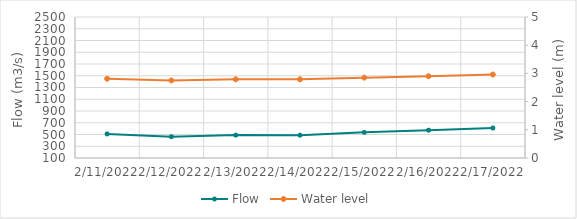
| Category | Flow |
|---|---|
| 7/29/21 | 614.92 |
| 7/28/21 | 545.48 |
| 7/27/21 | 546.07 |
| 7/26/21 | 553.4 |
| 7/25/21 | 581.06 |
| 7/24/21 | 613.57 |
| 7/23/21 | 585.9 |